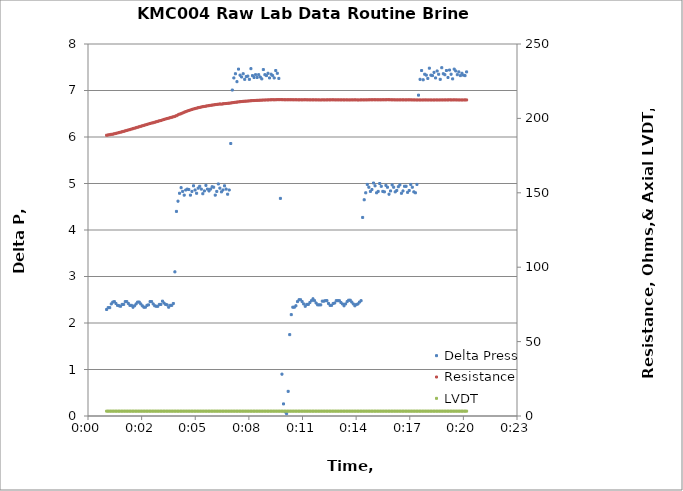
| Category | Delta Press |
|---|---|
| 0.0006944444444444445 | 2.29 |
| 0.0007523148137907912 | 2.33 |
| 0.0008101851831371379 | 2.33 |
| 0.0008680555524834846 | 2.41 |
| 0.0009259259218298313 | 2.45 |
| 0.0009837962911761781 | 2.46 |
| 0.0010416666605225248 | 2.42 |
| 0.0010995370371448291 | 2.38 |
| 0.0011574074064911758 | 2.37 |
| 0.0012152777758375225 | 2.36 |
| 0.0012731481451838693 | 2.4 |
| 0.001331018514530216 | 2.4 |
| 0.0013888888838765627 | 2.46 |
| 0.0014467592532229094 | 2.46 |
| 0.001504629622569256 | 2.42 |
| 0.0015624999991915604 | 2.38 |
| 0.001620370368537907 | 2.38 |
| 0.0016782407378842538 | 2.34 |
| 0.0017361111072306005 | 2.37 |
| 0.0017939814765769472 | 2.41 |
| 0.001851851845923294 | 2.45 |
| 0.0019097222152696406 | 2.45 |
| 0.001967592591891945 | 2.41 |
| 0.0020254629612382917 | 2.37 |
| 0.0020833333305846384 | 2.34 |
| 0.002141203699930985 | 2.34 |
| 0.0021990740692773318 | 2.38 |
| 0.0022569444386236785 | 2.39 |
| 0.002314814807970025 | 2.46 |
| 0.0023726851845923295 | 2.46 |
| 0.0024305555539386762 | 2.41 |
| 0.002488425923285023 | 2.37 |
| 0.0025462962926313696 | 2.36 |
| 0.0026041666619777163 | 2.36 |
| 0.002662037031324063 | 2.4 |
| 0.0027199074006704098 | 2.4 |
| 0.002777777777292714 | 2.47 |
| 0.0028356481466390608 | 2.43 |
| 0.0028935185159854075 | 2.4 |
| 0.002951388885331754 | 2.39 |
| 0.003009259254678101 | 2.34 |
| 0.0030671296240244476 | 2.38 |
| 0.0031249999933707943 | 2.38 |
| 0.0031828703699930986 | 2.42 |
| 0.0032407407393394453 | 3.1 |
| 0.003298611108685792 | 4.4 |
| 0.0033564814780321387 | 4.62 |
| 0.0034143518473784855 | 4.79 |
| 0.003472222216724832 | 4.91 |
| 0.003530092586071179 | 4.83 |
| 0.003587962962693483 | 4.75 |
| 0.00364583333203983 | 4.86 |
| 0.0037037037013861766 | 4.88 |
| 0.0037615740707325233 | 4.87 |
| 0.00381944444007887 | 4.75 |
| 0.0038773148094252167 | 4.83 |
| 0.003935185178771563 | 4.95 |
| 0.003993055555393868 | 4.86 |
| 0.0040509259247402144 | 4.79 |
| 0.004108796294086561 | 4.9 |
| 0.004166666663432908 | 4.94 |
| 0.004224537032779255 | 4.88 |
| 0.004282407402125601 | 4.78 |
| 0.004340277771471948 | 4.84 |
| 0.004398148148094252 | 4.96 |
| 0.004456018517440599 | 4.88 |
| 0.004513888886786946 | 4.84 |
| 0.004571759256133292 | 4.88 |
| 0.004629629625479639 | 4.93 |
| 0.004687499994825986 | 4.92 |
| 0.0047453703641723325 | 4.75 |
| 0.004803240740794637 | 4.83 |
| 0.0048611111101409836 | 4.99 |
| 0.00491898147948733 | 4.9 |
| 0.004976851848833677 | 4.82 |
| 0.005034722218180024 | 4.86 |
| 0.00509259258752637 | 4.95 |
| 0.005150462956872717 | 4.88 |
| 0.005208333333495021 | 4.77 |
| 0.005266203702841368 | 4.86 |
| 0.005324074072187715 | 5.86 |
| 0.0053819444415340615 | 7.01 |
| 0.005439814810880408 | 7.27 |
| 0.005497685180226755 | 7.36 |
| 0.005555555549573102 | 7.19 |
| 0.005613425918919448 | 7.46 |
| 0.005671296295541753 | 7.33 |
| 0.005729166664888099 | 7.29 |
| 0.005787037034234446 | 7.36 |
| 0.005844907403580793 | 7.24 |
| 0.0059027777729271395 | 7.3 |
| 0.005960648142273486 | 7.31 |
| 0.006018518511619833 | 7.24 |
| 0.006076388888242137 | 7.47 |
| 0.006134259257588484 | 7.32 |
| 0.006192129626934831 | 7.28 |
| 0.006249999996281177 | 7.34 |
| 0.006307870365627524 | 7.28 |
| 0.006365740734973871 | 7.34 |
| 0.0064236111043202175 | 7.29 |
| 0.006481481480942522 | 7.25 |
| 0.0065393518502888685 | 7.45 |
| 0.006597222219635215 | 7.34 |
| 0.006655092588981562 | 7.32 |
| 0.006712962958327909 | 7.37 |
| 0.006770833327674255 | 7.27 |
| 0.006828703697020602 | 7.35 |
| 0.006886574073642906 | 7.32 |
| 0.006944444442989253 | 7.27 |
| 0.0070023148123356 | 7.43 |
| 0.0070601851816819465 | 7.37 |
| 0.007118055551028293 | 7.26 |
| 0.00717592592037464 | 4.68 |
| 0.007233796289720987 | 0.9 |
| 0.007291666666343291 | 0.26 |
| 0.007349537035689638 | 0.09 |
| 0.007407407405035984 | 0.05 |
| 0.007465277774382331 | 0.53 |
| 0.007523148143728678 | 1.75 |
| 0.0075810185130750244 | 2.18 |
| 0.007638888882421371 | 2.34 |
| 0.0076967592590436755 | 2.34 |
| 0.007754629628390022 | 2.37 |
| 0.007812499997736369 | 2.46 |
| 0.007870370367082716 | 2.5 |
| 0.007928240736429063 | 2.5 |
| 0.00798611110577541 | 2.46 |
| 0.008043981475121757 | 2.41 |
| 0.008101851851744061 | 2.36 |
| 0.008159722221090408 | 2.4 |
| 0.008217592590436754 | 2.4 |
| 0.008275462959783101 | 2.44 |
| 0.008333333329129448 | 2.48 |
| 0.008391203698475794 | 2.52 |
| 0.008449074067822141 | 2.48 |
| 0.008506944444444445 | 2.43 |
| 0.008564814813790792 | 2.39 |
| 0.008622685183137139 | 2.39 |
| 0.008680555552483486 | 2.39 |
| 0.008738425921829832 | 2.47 |
| 0.008796296291176179 | 2.47 |
| 0.008854166660522526 | 2.48 |
| 0.00891203703714483 | 2.48 |
| 0.008969907406491177 | 2.42 |
| 0.009027777775837523 | 2.38 |
| 0.00908564814518387 | 2.38 |
| 0.009143518514530217 | 2.42 |
| 0.009201388883876564 | 2.43 |
| 0.00925925925322291 | 2.48 |
| 0.009317129622569257 | 2.48 |
| 0.009374999999191561 | 2.48 |
| 0.009432870368537908 | 2.44 |
| 0.009490740737884255 | 2.41 |
| 0.009548611107230601 | 2.37 |
| 0.009606481476576948 | 2.41 |
| 0.009664351845923295 | 2.46 |
| 0.009722222215269642 | 2.49 |
| 0.009780092591891946 | 2.49 |
| 0.009837962961238293 | 2.45 |
| 0.00989583333058464 | 2.41 |
| 0.009953703699930986 | 2.37 |
| 0.010011574069277333 | 2.4 |
| 0.01006944443862368 | 2.41 |
| 0.010127314807970026 | 2.45 |
| 0.01018518518459233 | 2.48 |
| 0.010243055553938677 | 4.27 |
| 0.010300925923285024 | 4.65 |
| 0.01035879629263137 | 4.8 |
| 0.010416666661977717 | 4.98 |
| 0.010474537031324064 | 4.92 |
| 0.01053240740067041 | 4.83 |
| 0.010590277777292715 | 4.87 |
| 0.010648148146639062 | 5.01 |
| 0.010706018515985408 | 4.95 |
| 0.010763888885331755 | 4.8 |
| 0.010821759254678102 | 4.83 |
| 0.010879629624024448 | 5 |
| 0.010937499993370795 | 4.94 |
| 0.0109953703699931 | 4.83 |
| 0.011053240739339446 | 4.82 |
| 0.011111111108685793 | 4.96 |
| 0.01116898147803214 | 4.92 |
| 0.011226851847378486 | 4.77 |
| 0.011284722216724833 | 4.84 |
| 0.01134259258607118 | 4.97 |
| 0.011400462962693484 | 4.92 |
| 0.01145833333203983 | 4.82 |
| 0.011516203701386177 | 4.85 |
| 0.011574074070732524 | 4.93 |
| 0.011631944440078871 | 4.97 |
| 0.011689814809425218 | 4.79 |
| 0.011747685178771564 | 4.84 |
| 0.011805555555393869 | 4.94 |
| 0.011863425924740215 | 4.94 |
| 0.011921296294086562 | 4.81 |
| 0.011979166663432909 | 4.85 |
| 0.012037037032779255 | 4.98 |
| 0.012094907402125602 | 4.92 |
| 0.012152777771471949 | 4.82 |
| 0.012210648148094253 | 4.8 |
| 0.0122685185174406 | 4.98 |
| 0.012326388886786947 | 6.9 |
| 0.012384259256133293 | 7.24 |
| 0.01244212962547964 | 7.43 |
| 0.012499999994825987 | 7.23 |
| 0.012557870364172333 | 7.35 |
| 0.012615740740794638 | 7.33 |
| 0.012673611110140984 | 7.26 |
| 0.012731481479487331 | 7.48 |
| 0.012789351848833678 | 7.33 |
| 0.012847222218180025 | 7.32 |
| 0.012905092587526371 | 7.39 |
| 0.012962962956872718 | 7.27 |
| 0.013020833333495022 | 7.42 |
| 0.013078703702841369 | 7.35 |
| 0.013136574072187716 | 7.24 |
| 0.013194444441534062 | 7.49 |
| 0.013252314810880409 | 7.36 |
| 0.013310185180226756 | 7.34 |
| 0.013368055549573103 | 7.43 |
| 0.01342592591891945 | 7.28 |
| 0.013483796295541754 | 7.44 |
| 0.0135416666648881 | 7.35 |
| 0.013599537034234447 | 7.25 |
| 0.013657407403580794 | 7.46 |
| 0.01371527777292714 | 7.42 |
| 0.013773148142273487 | 7.34 |
| 0.013831018511619834 | 7.4 |
| 0.013888888888242138 | 7.32 |
| 0.013946759257588485 | 7.37 |
| 0.014004629626934832 | 7.33 |
| 0.014062499996281178 | 7.32 |
| 0.014120370365627525 | 7.4 |